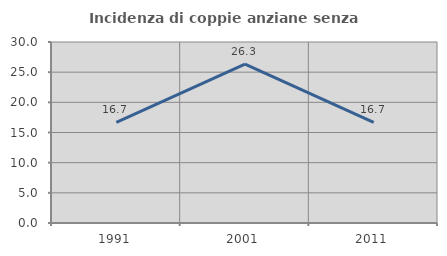
| Category | Incidenza di coppie anziane senza figli  |
|---|---|
| 1991.0 | 16.667 |
| 2001.0 | 26.316 |
| 2011.0 | 16.667 |